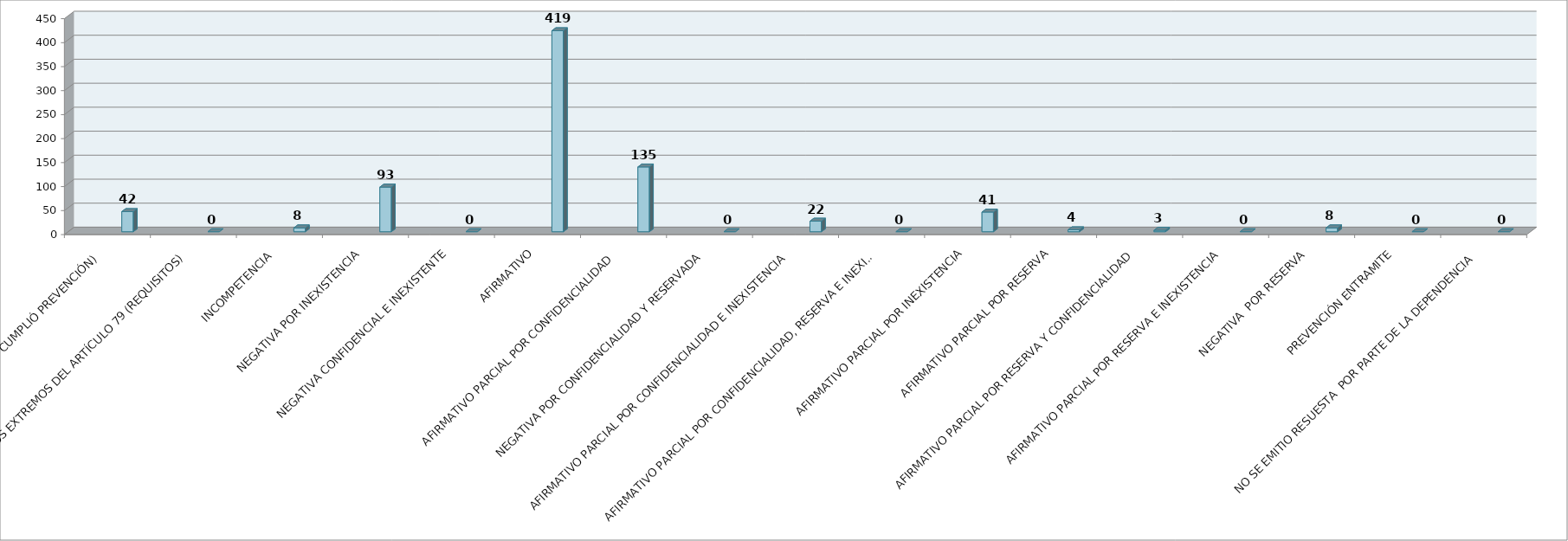
| Category | Series 0 | Series 1 | Series 2 | Series 3 | Series 4 | Series 5 |
|---|---|---|---|---|---|---|
| SE TIENE POR NO PRESENTADA ( NO CUMPLIÓ PREVENCIÓN) |  |  |  |  | 42 |  |
| NO CUMPLIO CON LOS EXTREMOS DEL ARTÍCULO 79 (REQUISITOS) |  |  |  |  | 0 |  |
| INCOMPETENCIA  |  |  |  |  | 8 |  |
| NEGATIVA POR INEXISTENCIA |  |  |  |  | 93 |  |
| NEGATIVA CONFIDENCIAL E INEXISTENTE |  |  |  |  | 0 |  |
| AFIRMATIVO |  |  |  |  | 419 |  |
| AFIRMATIVO PARCIAL POR CONFIDENCIALIDAD  |  |  |  |  | 135 |  |
| NEGATIVA POR CONFIDENCIALIDAD Y RESERVADA |  |  |  |  | 0 |  |
| AFIRMATIVO PARCIAL POR CONFIDENCIALIDAD E INEXISTENCIA |  |  |  |  | 22 |  |
| AFIRMATIVO PARCIAL POR CONFIDENCIALIDAD, RESERVA E INEXISTENCIA |  |  |  |  | 0 |  |
| AFIRMATIVO PARCIAL POR INEXISTENCIA |  |  |  |  | 41 |  |
| AFIRMATIVO PARCIAL POR RESERVA |  |  |  |  | 4 |  |
| AFIRMATIVO PARCIAL POR RESERVA Y CONFIDENCIALIDAD |  |  |  |  | 3 |  |
| AFIRMATIVO PARCIAL POR RESERVA E INEXISTENCIA |  |  |  |  | 0 |  |
| NEGATIVA  POR RESERVA |  |  |  |  | 8 |  |
| PREVENCIÓN ENTRAMITE |  |  |  |  | 0 |  |
| NO SE EMITIO RESUESTA  POR PARTE DE LA DEPENDENCIA |  |  |  |  | 0 |  |